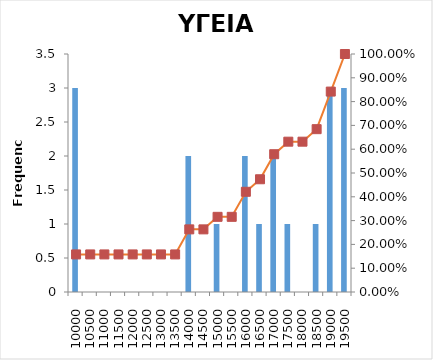
| Category | Series 0 |
|---|---|
| 10000 | 3 |
| 10500 | 0 |
| 11000 | 0 |
| 11500 | 0 |
| 12000 | 0 |
| 12500 | 0 |
| 13000 | 0 |
| 13500 | 0 |
| 14000 | 2 |
| 14500 | 0 |
| 15000 | 1 |
| 15500 | 0 |
| 16000 | 2 |
| 16500 | 1 |
| 17000 | 2 |
| 17500 | 1 |
| 18000 | 0 |
| 18500 | 1 |
| 19000 | 3 |
| 19500 | 3 |